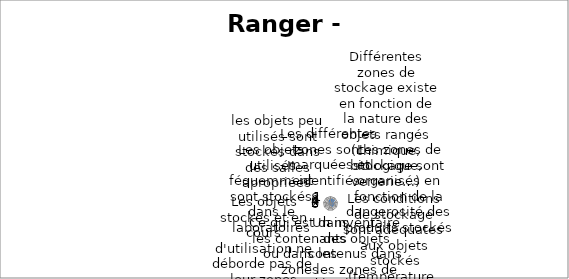
| Category | Series 2 |
|---|---|
| Les différentes zones sont marquées et identifiés | 5 |
| Différentes zones de stockage existe en fonction de la nature des objets rangés (chimique, biologique, verrerie…) | 5 |
| Les zones de stockage sont organisés en fonction de la dangerosité des produits stockés | 1 |
| Les conditions de stockage sont adéquates aux objets stockés (température, humidités…) | 5 |
| Un inventaire des objets contenus dans les zones de stockage et laboratoire est à disposition | 1 |
| Ce qui est dans les contenants ou dans les zones correspond bien aux indications | 1 |
| Les objets stockés et en cours d'utilisation ne déborde pas de leur zones | 1 |
| Les objets utilisés féquemment sont stockés dans le laboratoires | 1 |
| les objets peu utilisés sont stockés dans des salles apropriées | 1 |